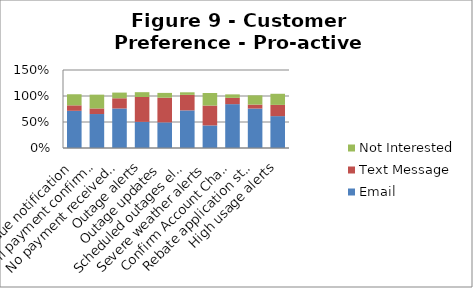
| Category | Email | Text Message | Not Interested |
|---|---|---|---|
| Bill due notification | 0.715 | 0.105 | 0.213 |
| Bill payment confirmation | 0.653 | 0.108 | 0.265 |
| No payment received notification | 0.76 | 0.196 | 0.109 |
| Outage alerts | 0.503 | 0.478 | 0.092 |
| Outage updates | 0.493 | 0.474 | 0.092 |
| Scheduled outages electric | 0.723 | 0.299 | 0.049 |
| Severe weather alerts | 0.434 | 0.383 | 0.241 |
| Confirm Account Change | 0.843 | 0.121 | 0.067 |
| Rebate application status update | 0.759 | 0.076 | 0.177 |
| High usage alerts | 0.613 | 0.216 | 0.214 |